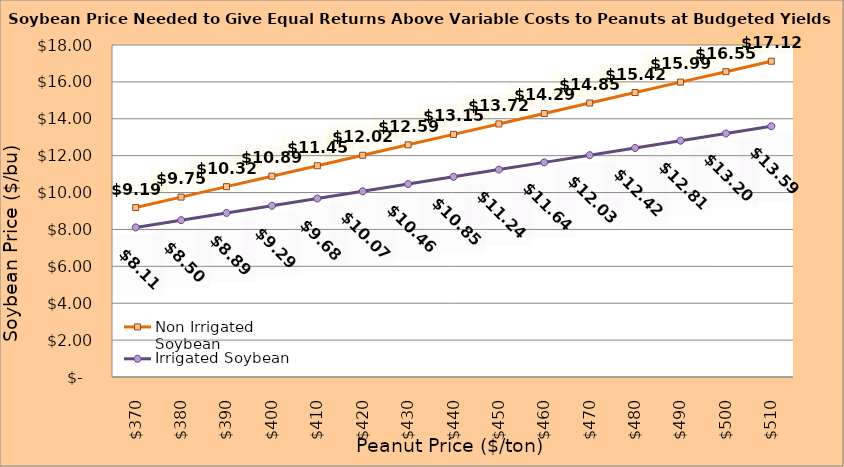
| Category | Non Irrigated Soybean | Irrigated Soybean |
|---|---|---|
| 370.0 | 9.187 | 8.111 |
| 380.0 | 9.754 | 8.503 |
| 390.0 | 10.321 | 8.895 |
| 400.0 | 10.887 | 9.286 |
| 410.0 | 11.454 | 9.678 |
| 420.0 | 12.021 | 10.07 |
| 430.0 | 12.587 | 10.461 |
| 440.0 | 13.154 | 10.853 |
| 450.0 | 13.721 | 11.245 |
| 460.0 | 14.287 | 11.636 |
| 470.0 | 14.854 | 12.028 |
| 480.0 | 15.421 | 12.42 |
| 490.0 | 15.987 | 12.811 |
| 500.0 | 16.554 | 13.203 |
| 510.0 | 17.121 | 13.595 |